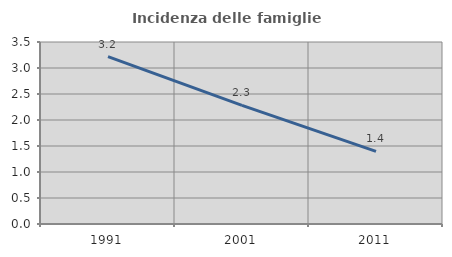
| Category | Incidenza delle famiglie numerose |
|---|---|
| 1991.0 | 3.22 |
| 2001.0 | 2.282 |
| 2011.0 | 1.397 |